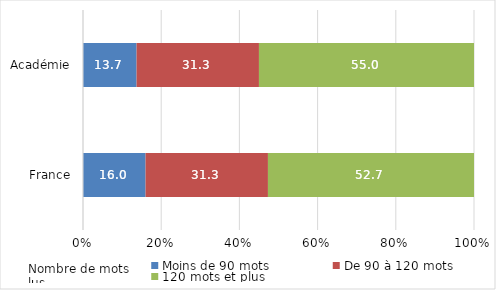
| Category | Moins de 90 mots | De 90 à 120 mots | 120 mots et plus |
|---|---|---|---|
| France | 16 | 31.3 | 52.7 |
| Académie | 13.7 | 31.3 | 55 |